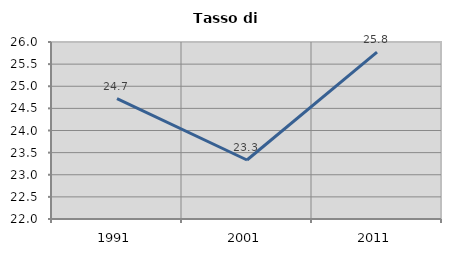
| Category | Tasso di disoccupazione   |
|---|---|
| 1991.0 | 24.719 |
| 2001.0 | 23.333 |
| 2011.0 | 25.769 |